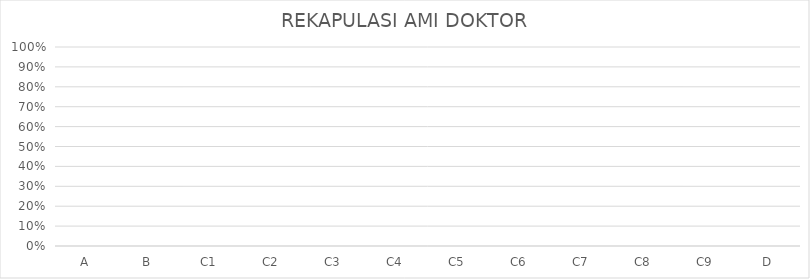
| Category | REKAPULASI AMI DOKTOR |
|---|---|
| A | 0 |
| B | 0 |
| C1 | 0 |
| C2 | 0 |
| C3 | 0 |
| C4 | 0 |
| C5 | 0 |
| C6 | 0 |
| C7 | 0 |
| C8 | 0 |
| C9 | 0 |
| D | 0 |